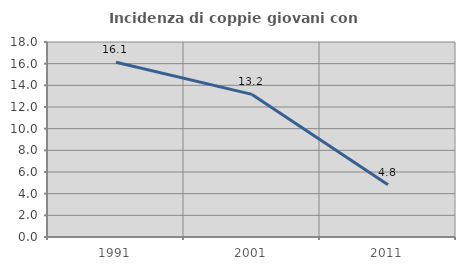
| Category | Incidenza di coppie giovani con figli |
|---|---|
| 1991.0 | 16.137 |
| 2001.0 | 13.164 |
| 2011.0 | 4.822 |